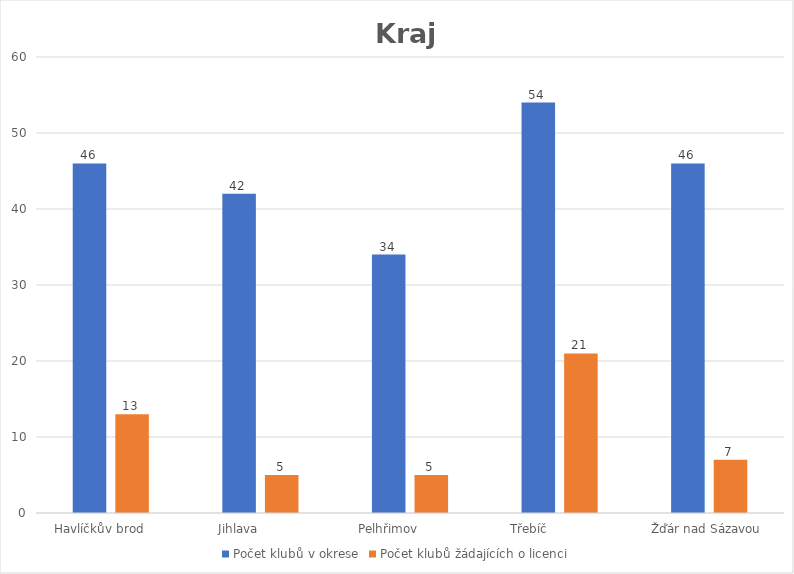
| Category | Počet klubů v okrese | Počet klubů žádajících o licenci |
|---|---|---|
| Havlíčkův brod      | 46 | 13 |
| Jihlava            | 42 | 5 |
| Pelhřimov            | 34 | 5 |
| Třebíč                | 54 | 21 |
| Žďár nad Sázavou  | 46 | 7 |